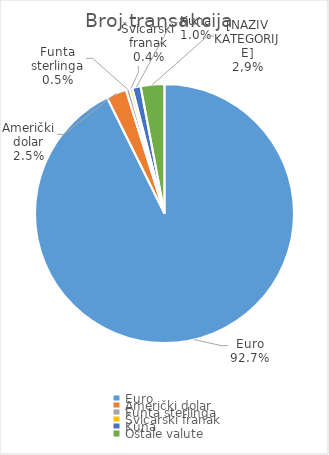
| Category | Broj transakcija  |
|---|---|
| Euro | 4222666 |
| Američki dolar | 114366 |
| Funta sterlinga | 21185 |
| Švicarski franak | 16040 |
| Kuna | 47503 |
| Ostale valute | 134796 |